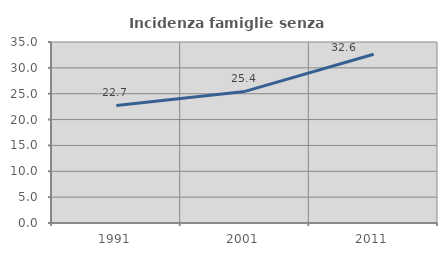
| Category | Incidenza famiglie senza nuclei |
|---|---|
| 1991.0 | 22.733 |
| 2001.0 | 25.445 |
| 2011.0 | 32.631 |